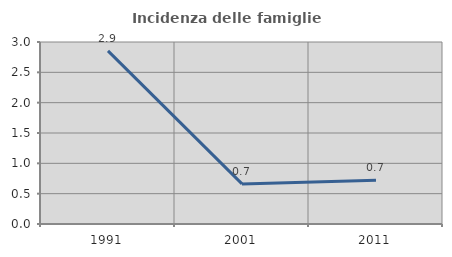
| Category | Incidenza delle famiglie numerose |
|---|---|
| 1991.0 | 2.854 |
| 2001.0 | 0.66 |
| 2011.0 | 0.72 |